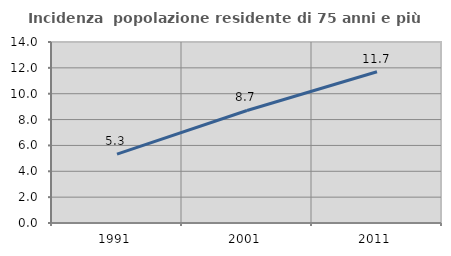
| Category | Incidenza  popolazione residente di 75 anni e più |
|---|---|
| 1991.0 | 5.324 |
| 2001.0 | 8.704 |
| 2011.0 | 11.698 |